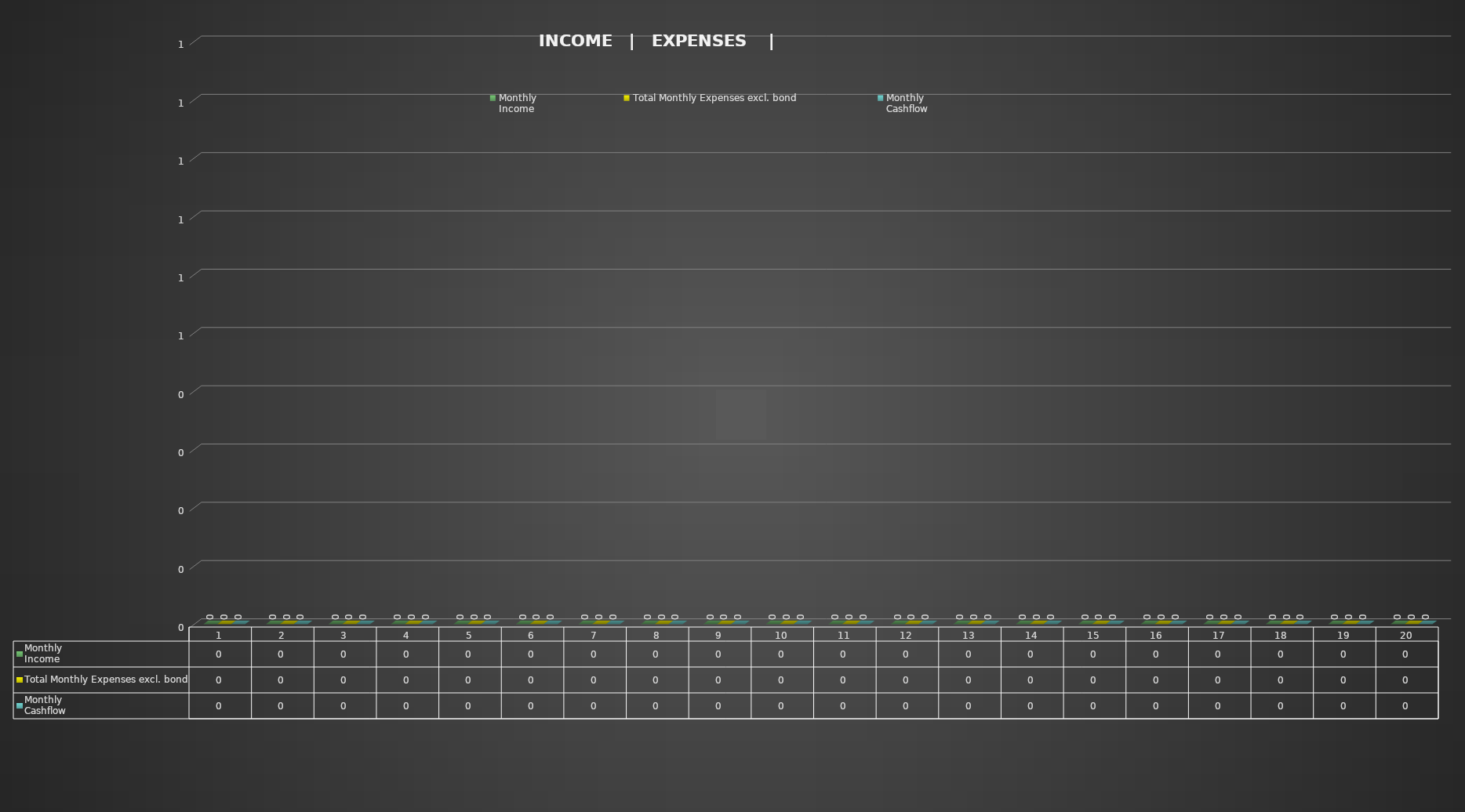
| Category | Monthly
Income | Total Monthly Expenses excl. bond | Monthly
Cashflow |
|---|---|---|---|
| 0 | 0 | 0 | 0 |
| 1 | 0 | 0 | 0 |
| 2 | 0 | 0 | 0 |
| 3 | 0 | 0 | 0 |
| 4 | 0 | 0 | 0 |
| 5 | 0 | 0 | 0 |
| 6 | 0 | 0 | 0 |
| 7 | 0 | 0 | 0 |
| 8 | 0 | 0 | 0 |
| 9 | 0 | 0 | 0 |
| 10 | 0 | 0 | 0 |
| 11 | 0 | 0 | 0 |
| 12 | 0 | 0 | 0 |
| 13 | 0 | 0 | 0 |
| 14 | 0 | 0 | 0 |
| 15 | 0 | 0 | 0 |
| 16 | 0 | 0 | 0 |
| 17 | 0 | 0 | 0 |
| 18 | 0 | 0 | 0 |
| 19 | 0 | 0 | 0 |